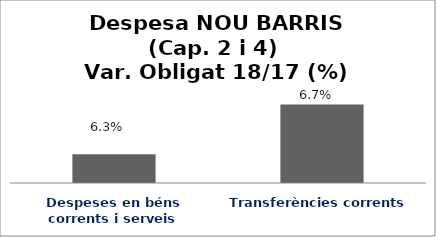
| Category | Series 0 |
|---|---|
| Despeses en béns corrents i serveis | 0.063 |
| Transferències corrents | 0.067 |